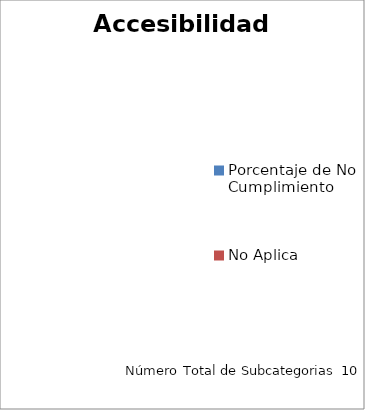
| Category | Accesibilidad Web |
|---|---|
| Porcentaje de No Cumplimiento | 0 |
| No Aplica | 0 |